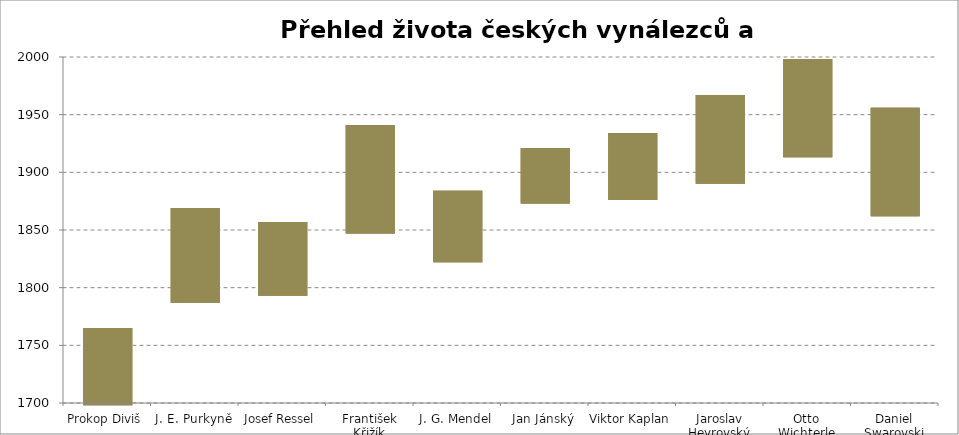
| Category | narozen | Series 1 | zemřel |
|---|---|---|---|
| Prokop Diviš | 1698 |  | 1765 |
| J. E. Purkyně | 1787 |  | 1869 |
| Josef Ressel | 1793 |  | 1857 |
| František Křižík | 1847 |  | 1941 |
| J. G. Mendel | 1822 |  | 1884 |
| Jan Jánský | 1873 |  | 1921 |
| Viktor Kaplan | 1876 |  | 1934 |
| Jaroslav Heyrovský | 1890 |  | 1967 |
| Otto Wichterle | 1913 |  | 1998 |
| Daniel Swarovski | 1862 |  | 1956 |